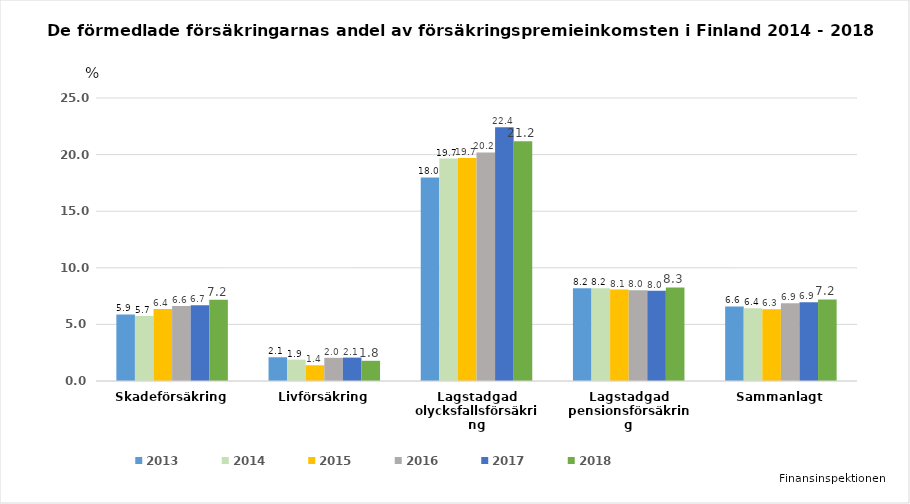
| Category | 2013 | 2014 | 2015 | 2016 | 2017 | 2018 |
|---|---|---|---|---|---|---|
| Skadeförsäkring | 5.882 | 5.737 | 6.356 | 6.621 | 6.681 | 7.184 |
| Livförsäkring | 2.097 | 1.88 | 1.39 | 2.047 | 2.067 | 1.786 |
| Lagstadgad olycksfallsförsäkring | 17.98 | 19.654 | 19.692 | 20.194 | 22.408 | 21.186 |
| Lagstadgad pensionsförsäkring | 8.204 | 8.203 | 8.075 | 8.016 | 7.982 | 8.268 |
| Sammanlagt | 6.584 | 6.436 | 6.337 | 6.875 | 6.948 | 7.208 |